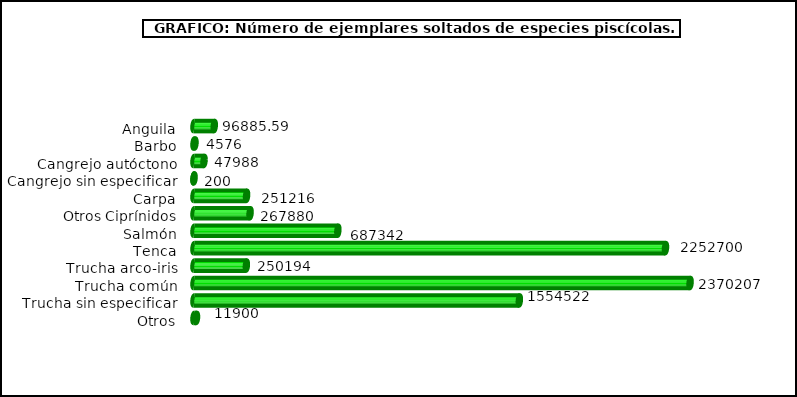
| Category | Series 1 |
|---|---|
| Anguila | 96885.59 |
| Barbo | 4576 |
| Cangrejo autóctono | 47988 |
| Cangrejo sin especificar | 200 |
| Carpa | 251216 |
| Otros Ciprínidos | 267880 |
| Salmón | 687342 |
| Tenca | 2252700 |
| Trucha arco-iris | 250194 |
| Trucha común | 2370207 |
| Trucha sin especificar | 1554522 |
| Otros | 11900 |